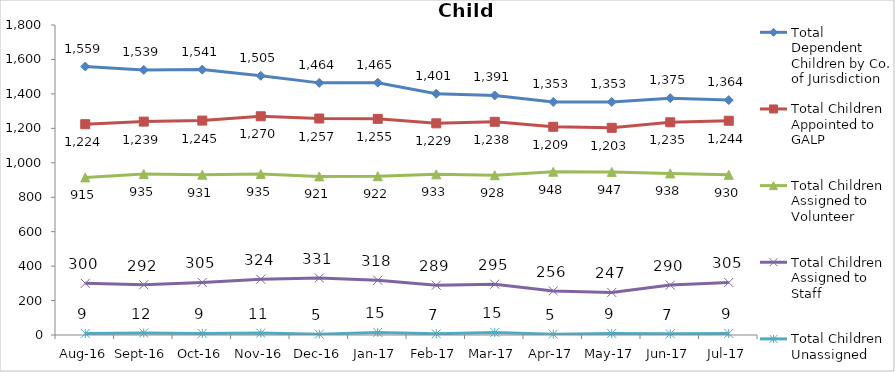
| Category | Total Dependent Children by Co. of Jurisdiction | Total Children Appointed to GALP | Total Children Assigned to Volunteer | Total Children Assigned to Staff | Total Children Unassigned |
|---|---|---|---|---|---|
| Aug-16 | 1559 | 1224 | 915 | 300 | 9 |
| Sep-16 | 1539 | 1239 | 935 | 292 | 12 |
| Oct-16 | 1541 | 1245 | 931 | 305 | 9 |
| Nov-16 | 1505 | 1270 | 935 | 324 | 11 |
| Dec-16 | 1464 | 1257 | 921 | 331 | 5 |
| Jan-17 | 1465 | 1255 | 922 | 318 | 15 |
| Feb-17 | 1401 | 1229 | 933 | 289 | 7 |
| Mar-17 | 1391 | 1238 | 928 | 295 | 15 |
| Apr-17 | 1353 | 1209 | 948 | 256 | 5 |
| May-17 | 1353 | 1203 | 947 | 247 | 9 |
| Jun-17 | 1375 | 1235 | 938 | 290 | 7 |
| Jul-17 | 1364 | 1244 | 930 | 305 | 9 |